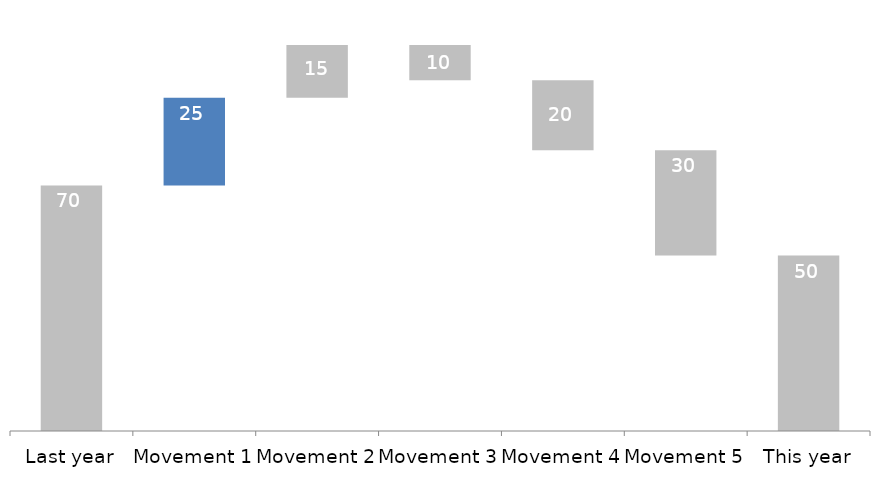
| Category | Hidden bars | Bars you see |
|---|---|---|
| Last year | 0 | 70 |
| Movement 1 | 70 | 25 |
| Movement 2 | 95 | 15 |
| Movement 3 | 100 | 10 |
| Movement 4 | 80 | 20 |
| Movement 5 | 50 | 30 |
| This year | 0 | 50 |